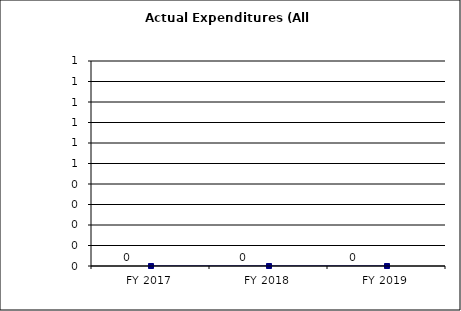
| Category | Actual Expenditures (All Funds) |
|---|---|
| FY 2017 | 0 |
| FY 2018 | 0 |
| FY 2019 | 0 |